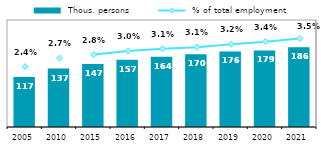
| Category |  Thous. persons |
|---|---|
| 2005 | 116.67 |
| 2010 | 136.668 |
| 2015 | 147.389 |
| 2016 | 157.142 |
| 2017 | 164.209 |
| 2018 | 169.722 |
| 2019 | 176.484 |
| 2020 | 178.818 |
| 2021 | 186.201 |